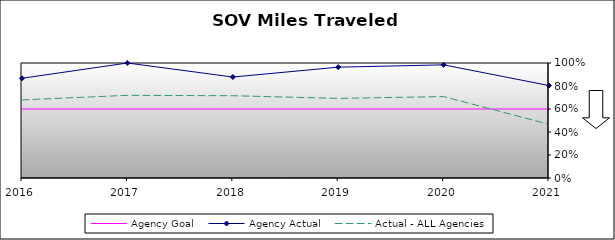
| Category | Agency Goal | Agency Actual | Actual - ALL Agencies |
|---|---|---|---|
| 2016.0 | 0.6 | 0.867 | 0.679 |
| 2017.0 | 0.6 | 1 | 0.719 |
| 2018.0 | 0.6 | 0.878 | 0.715 |
| 2019.0 | 0.6 | 0.964 | 0.692 |
| 2020.0 | 0.6 | 0.984 | 0.708 |
| 2021.0 | 0.6 | 0.804 | 0.467 |